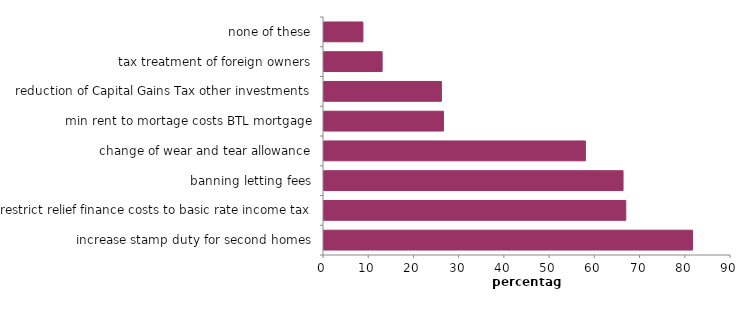
| Category | Series 0 |
|---|---|
| increase stamp duty for second homes | 81.498 |
| restrict relief finance costs to basic rate income tax | 66.734 |
| banning letting fees | 66.127 |
| change of wear and tear allowance | 57.798 |
| min rent to mortage costs BTL mortgage | 26.41 |
| reduction of Capital Gains Tax other investments | 25.966 |
| tax treatment of foreign owners | 12.853 |
| none of these | 8.604 |